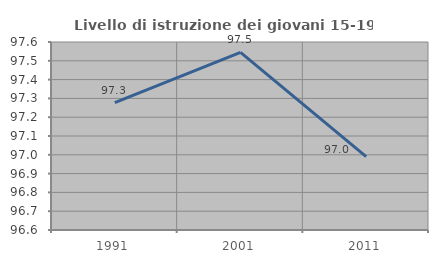
| Category | Livello di istruzione dei giovani 15-19 anni |
|---|---|
| 1991.0 | 97.278 |
| 2001.0 | 97.545 |
| 2011.0 | 96.991 |